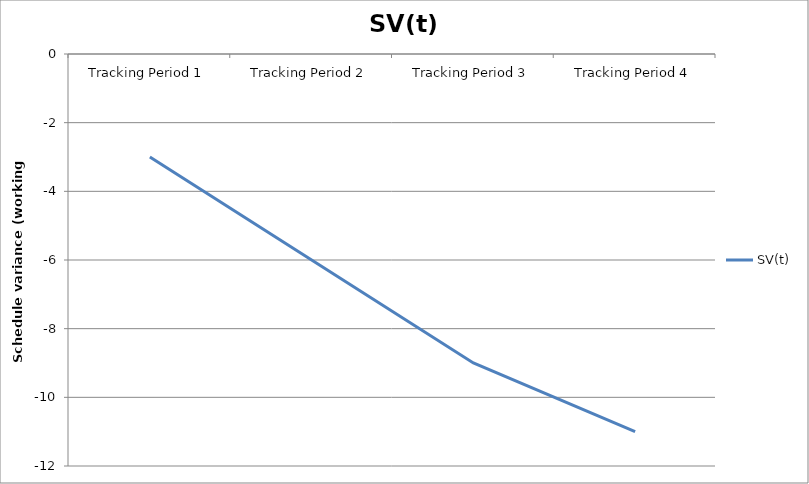
| Category | SV(t) |
|---|---|
| Tracking Period 1 | -3 |
| Tracking Period 2 | -6 |
| Tracking Period 3 | -9 |
| Tracking Period 4 | -11 |